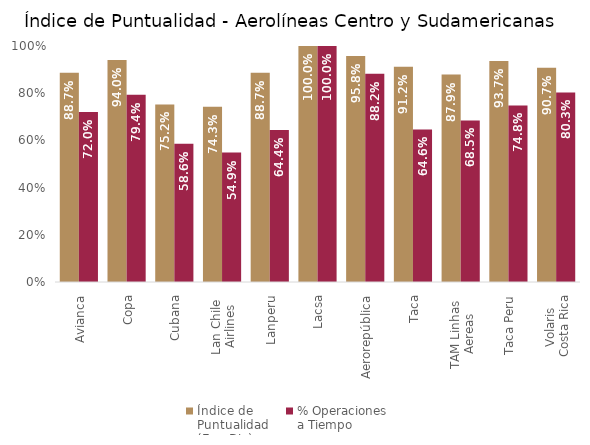
| Category | Índice de 
Puntualidad
(Ene-Dic) | % Operaciones 
a Tiempo |
|---|---|---|
| Avianca | 0.887 | 0.72 |
| Copa | 0.94 | 0.794 |
| Cubana | 0.752 | 0.586 |
| Lan Chile 
Airlines | 0.743 | 0.549 |
| Lanperu | 0.887 | 0.644 |
| Lacsa | 1 | 1 |
| Aerorepública | 0.958 | 0.882 |
| Taca | 0.912 | 0.646 |
| TAM Linhas 
Aereas | 0.879 | 0.685 |
| Taca Peru | 0.937 | 0.748 |
| Volaris 
Costa Rica | 0.907 | 0.803 |